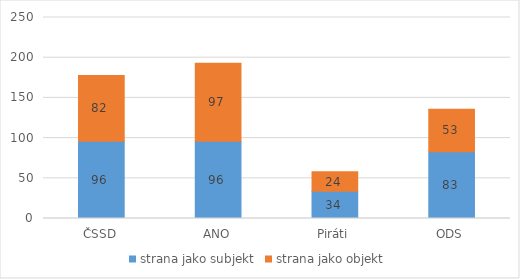
| Category | strana jako subjekt | strana jako objekt |
|---|---|---|
| ČSSD | 96 | 82 |
| ANO | 96 | 97 |
| Piráti | 34 | 24 |
| ODS | 83 | 53 |